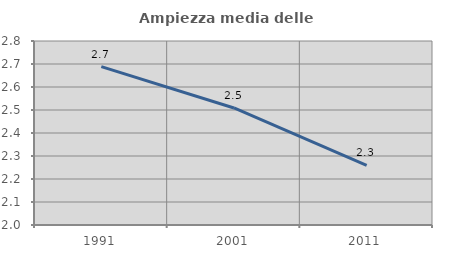
| Category | Ampiezza media delle famiglie |
|---|---|
| 1991.0 | 2.689 |
| 2001.0 | 2.509 |
| 2011.0 | 2.259 |